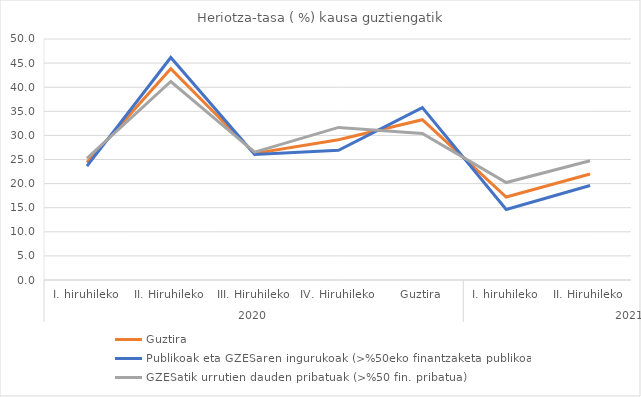
| Category | Guztira | Publikoak eta GZESaren ingurukoak (>%50eko finantzaketa publikoa) | GZESatik urrutien dauden pribatuak (>%50 fin. pribatua) |
|---|---|---|---|
| 0 | 24.387 | 23.637 | 25.249 |
| 1 | 43.85 | 46.17 | 41.185 |
| 2 | 26.257 | 26.027 | 26.52 |
| 3 | 29.109 | 26.898 | 31.655 |
| 4 | 33.252 | 35.771 | 30.385 |
| 5 | 17.215 | 14.616 | 20.22 |
| 6 | 21.996 | 19.617 | 24.727 |